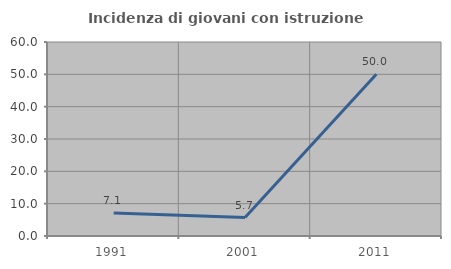
| Category | Incidenza di giovani con istruzione universitaria |
|---|---|
| 1991.0 | 7.143 |
| 2001.0 | 5.714 |
| 2011.0 | 50 |